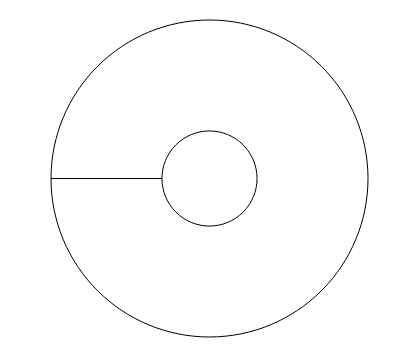
| Category | Series 0 |
|---|---|
| 0 | 0 |
| 1 | 360 |